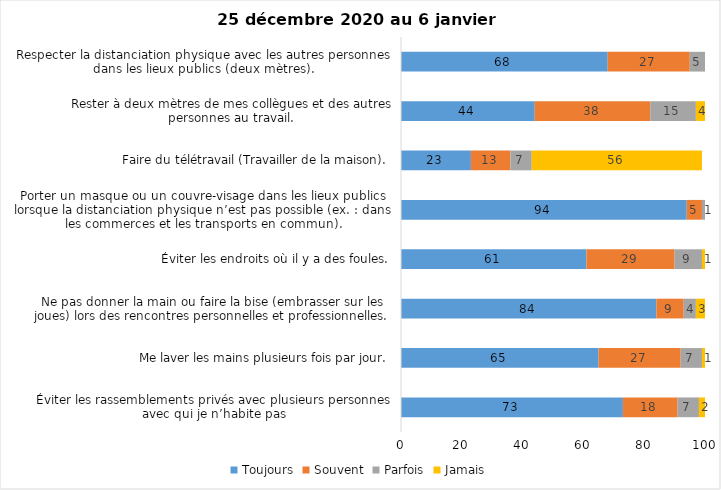
| Category | Toujours | Souvent | Parfois | Jamais |
|---|---|---|---|---|
| Éviter les rassemblements privés avec plusieurs personnes avec qui je n’habite pas | 73 | 18 | 7 | 2 |
| Me laver les mains plusieurs fois par jour. | 65 | 27 | 7 | 1 |
| Ne pas donner la main ou faire la bise (embrasser sur les joues) lors des rencontres personnelles et professionnelles. | 84 | 9 | 4 | 3 |
| Éviter les endroits où il y a des foules. | 61 | 29 | 9 | 1 |
| Porter un masque ou un couvre-visage dans les lieux publics lorsque la distanciation physique n’est pas possible (ex. : dans les commerces et les transports en commun). | 94 | 5 | 1 | 0 |
| Faire du télétravail (Travailler de la maison). | 23 | 13 | 7 | 56 |
| Rester à deux mètres de mes collègues et des autres personnes au travail. | 44 | 38 | 15 | 4 |
| Respecter la distanciation physique avec les autres personnes dans les lieux publics (deux mètres). | 68 | 27 | 5 | 0 |